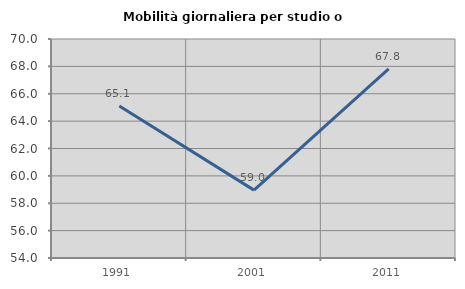
| Category | Mobilità giornaliera per studio o lavoro |
|---|---|
| 1991.0 | 65.102 |
| 2001.0 | 58.959 |
| 2011.0 | 67.811 |